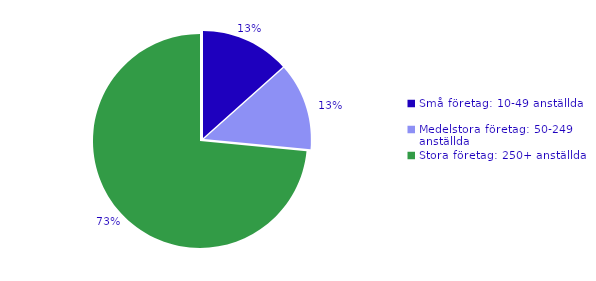
| Category | 2021 |
|---|---|
| Små företag: 10-49 anställda | 9721 |
| Medelstora företag: 50-249 anställda | 9513 |
| Stora företag: 250+ anställda | 53267 |